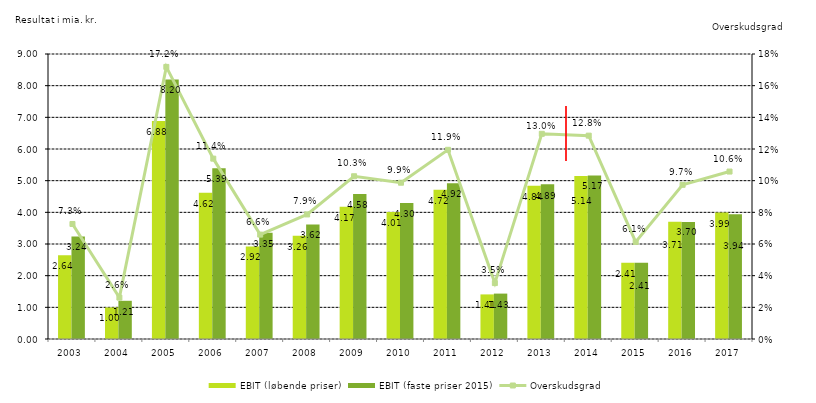
| Category | EBIT (løbende priser) | EBIT (faste priser 2015) |
|---|---|---|
| 2003.0 | 2.643 | 3.239 |
| 2004.0 | 0.995 | 1.206 |
| 2005.0 | 6.885 | 8.196 |
| 2006.0 | 4.616 | 5.393 |
| 2007.0 | 2.922 | 3.355 |
| 2008.0 | 3.26 | 3.618 |
| 2009.0 | 4.174 | 4.576 |
| 2010.0 | 4.007 | 4.295 |
| 2011.0 | 4.716 | 4.917 |
| 2012.0 | 1.408 | 1.434 |
| 2013.0 | 4.838 | 4.886 |
| 2014.0 | 5.145 | 5.165 |
| 2015.0 | 2.41 | 2.41 |
| 2016.0 | 3.706 | 3.695 |
| 2017.0 | 3.992 | 3.937 |